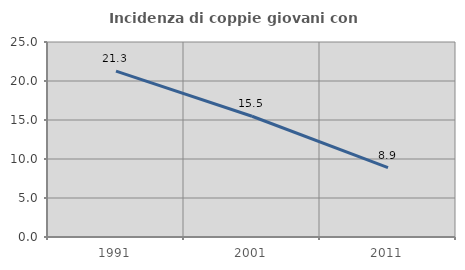
| Category | Incidenza di coppie giovani con figli |
|---|---|
| 1991.0 | 21.258 |
| 2001.0 | 15.479 |
| 2011.0 | 8.883 |